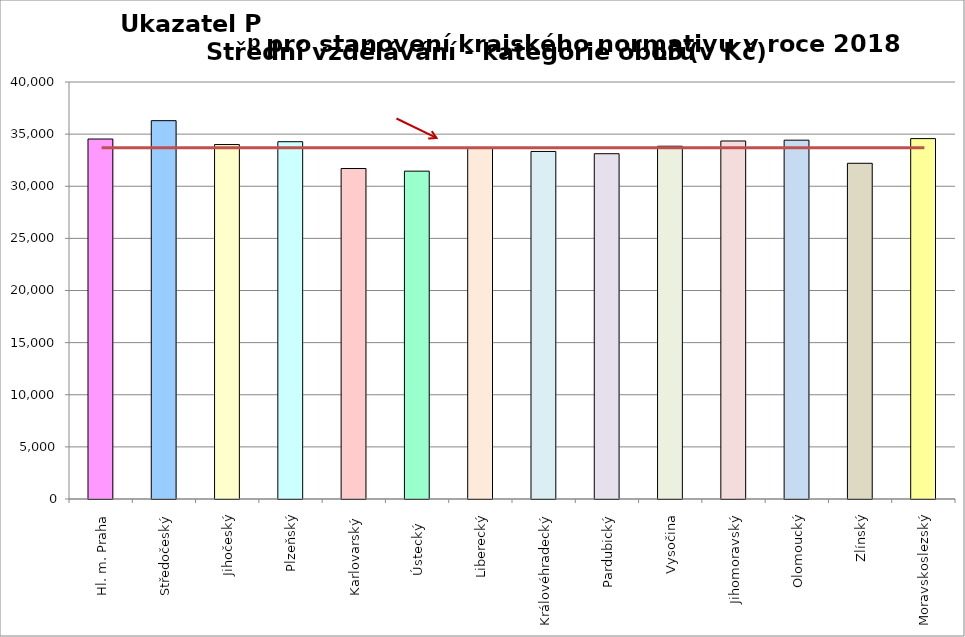
| Category | Series 0 |
|---|---|
| Hl. m. Praha | 34530 |
| Středočeský | 36291 |
| Jihočeský | 34000 |
| Plzeňský | 34272 |
| Karlovarský  | 31700 |
| Ústecký   | 31448 |
| Liberecký | 33620 |
| Královéhradecký | 33337 |
| Pardubický | 33121 |
| Vysočina | 33839 |
| Jihomoravský | 34341 |
| Olomoucký | 34420 |
| Zlínský | 32203 |
| Moravskoslezský | 34570 |